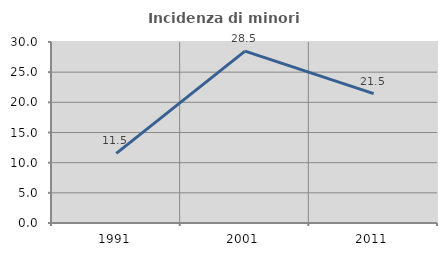
| Category | Incidenza di minori stranieri |
|---|---|
| 1991.0 | 11.538 |
| 2001.0 | 28.492 |
| 2011.0 | 21.45 |